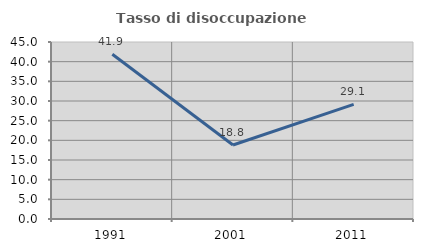
| Category | Tasso di disoccupazione giovanile  |
|---|---|
| 1991.0 | 41.892 |
| 2001.0 | 18.824 |
| 2011.0 | 29.126 |